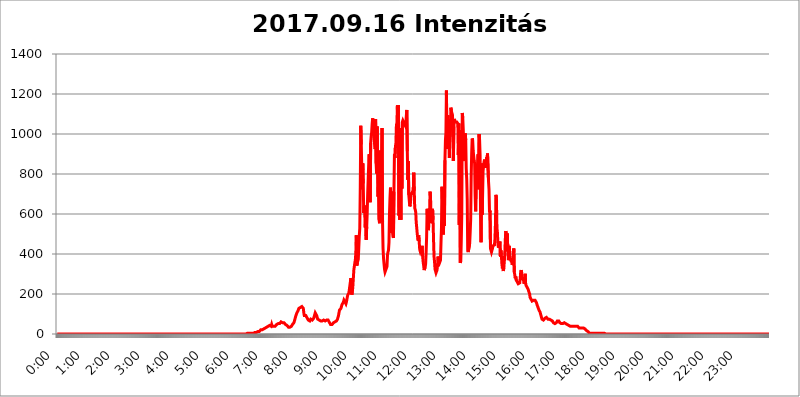
| Category | 2017.09.16 Intenzitás [W/m^2] |
|---|---|
| 0.0 | 0 |
| 0.0006944444444444445 | 0 |
| 0.001388888888888889 | 0 |
| 0.0020833333333333333 | 0 |
| 0.002777777777777778 | 0 |
| 0.003472222222222222 | 0 |
| 0.004166666666666667 | 0 |
| 0.004861111111111111 | 0 |
| 0.005555555555555556 | 0 |
| 0.0062499999999999995 | 0 |
| 0.006944444444444444 | 0 |
| 0.007638888888888889 | 0 |
| 0.008333333333333333 | 0 |
| 0.009027777777777779 | 0 |
| 0.009722222222222222 | 0 |
| 0.010416666666666666 | 0 |
| 0.011111111111111112 | 0 |
| 0.011805555555555555 | 0 |
| 0.012499999999999999 | 0 |
| 0.013194444444444444 | 0 |
| 0.013888888888888888 | 0 |
| 0.014583333333333332 | 0 |
| 0.015277777777777777 | 0 |
| 0.015972222222222224 | 0 |
| 0.016666666666666666 | 0 |
| 0.017361111111111112 | 0 |
| 0.018055555555555557 | 0 |
| 0.01875 | 0 |
| 0.019444444444444445 | 0 |
| 0.02013888888888889 | 0 |
| 0.020833333333333332 | 0 |
| 0.02152777777777778 | 0 |
| 0.022222222222222223 | 0 |
| 0.02291666666666667 | 0 |
| 0.02361111111111111 | 0 |
| 0.024305555555555556 | 0 |
| 0.024999999999999998 | 0 |
| 0.025694444444444447 | 0 |
| 0.02638888888888889 | 0 |
| 0.027083333333333334 | 0 |
| 0.027777777777777776 | 0 |
| 0.02847222222222222 | 0 |
| 0.029166666666666664 | 0 |
| 0.029861111111111113 | 0 |
| 0.030555555555555555 | 0 |
| 0.03125 | 0 |
| 0.03194444444444445 | 0 |
| 0.03263888888888889 | 0 |
| 0.03333333333333333 | 0 |
| 0.034027777777777775 | 0 |
| 0.034722222222222224 | 0 |
| 0.035416666666666666 | 0 |
| 0.036111111111111115 | 0 |
| 0.03680555555555556 | 0 |
| 0.0375 | 0 |
| 0.03819444444444444 | 0 |
| 0.03888888888888889 | 0 |
| 0.03958333333333333 | 0 |
| 0.04027777777777778 | 0 |
| 0.04097222222222222 | 0 |
| 0.041666666666666664 | 0 |
| 0.042361111111111106 | 0 |
| 0.04305555555555556 | 0 |
| 0.043750000000000004 | 0 |
| 0.044444444444444446 | 0 |
| 0.04513888888888889 | 0 |
| 0.04583333333333334 | 0 |
| 0.04652777777777778 | 0 |
| 0.04722222222222222 | 0 |
| 0.04791666666666666 | 0 |
| 0.04861111111111111 | 0 |
| 0.049305555555555554 | 0 |
| 0.049999999999999996 | 0 |
| 0.05069444444444445 | 0 |
| 0.051388888888888894 | 0 |
| 0.052083333333333336 | 0 |
| 0.05277777777777778 | 0 |
| 0.05347222222222222 | 0 |
| 0.05416666666666667 | 0 |
| 0.05486111111111111 | 0 |
| 0.05555555555555555 | 0 |
| 0.05625 | 0 |
| 0.05694444444444444 | 0 |
| 0.057638888888888885 | 0 |
| 0.05833333333333333 | 0 |
| 0.05902777777777778 | 0 |
| 0.059722222222222225 | 0 |
| 0.06041666666666667 | 0 |
| 0.061111111111111116 | 0 |
| 0.06180555555555556 | 0 |
| 0.0625 | 0 |
| 0.06319444444444444 | 0 |
| 0.06388888888888888 | 0 |
| 0.06458333333333334 | 0 |
| 0.06527777777777778 | 0 |
| 0.06597222222222222 | 0 |
| 0.06666666666666667 | 0 |
| 0.06736111111111111 | 0 |
| 0.06805555555555555 | 0 |
| 0.06874999999999999 | 0 |
| 0.06944444444444443 | 0 |
| 0.07013888888888889 | 0 |
| 0.07083333333333333 | 0 |
| 0.07152777777777779 | 0 |
| 0.07222222222222223 | 0 |
| 0.07291666666666667 | 0 |
| 0.07361111111111111 | 0 |
| 0.07430555555555556 | 0 |
| 0.075 | 0 |
| 0.07569444444444444 | 0 |
| 0.0763888888888889 | 0 |
| 0.07708333333333334 | 0 |
| 0.07777777777777778 | 0 |
| 0.07847222222222222 | 0 |
| 0.07916666666666666 | 0 |
| 0.0798611111111111 | 0 |
| 0.08055555555555556 | 0 |
| 0.08125 | 0 |
| 0.08194444444444444 | 0 |
| 0.08263888888888889 | 0 |
| 0.08333333333333333 | 0 |
| 0.08402777777777777 | 0 |
| 0.08472222222222221 | 0 |
| 0.08541666666666665 | 0 |
| 0.08611111111111112 | 0 |
| 0.08680555555555557 | 0 |
| 0.08750000000000001 | 0 |
| 0.08819444444444445 | 0 |
| 0.08888888888888889 | 0 |
| 0.08958333333333333 | 0 |
| 0.09027777777777778 | 0 |
| 0.09097222222222222 | 0 |
| 0.09166666666666667 | 0 |
| 0.09236111111111112 | 0 |
| 0.09305555555555556 | 0 |
| 0.09375 | 0 |
| 0.09444444444444444 | 0 |
| 0.09513888888888888 | 0 |
| 0.09583333333333333 | 0 |
| 0.09652777777777777 | 0 |
| 0.09722222222222222 | 0 |
| 0.09791666666666667 | 0 |
| 0.09861111111111111 | 0 |
| 0.09930555555555555 | 0 |
| 0.09999999999999999 | 0 |
| 0.10069444444444443 | 0 |
| 0.1013888888888889 | 0 |
| 0.10208333333333335 | 0 |
| 0.10277777777777779 | 0 |
| 0.10347222222222223 | 0 |
| 0.10416666666666667 | 0 |
| 0.10486111111111111 | 0 |
| 0.10555555555555556 | 0 |
| 0.10625 | 0 |
| 0.10694444444444444 | 0 |
| 0.1076388888888889 | 0 |
| 0.10833333333333334 | 0 |
| 0.10902777777777778 | 0 |
| 0.10972222222222222 | 0 |
| 0.1111111111111111 | 0 |
| 0.11180555555555556 | 0 |
| 0.11180555555555556 | 0 |
| 0.1125 | 0 |
| 0.11319444444444444 | 0 |
| 0.11388888888888889 | 0 |
| 0.11458333333333333 | 0 |
| 0.11527777777777777 | 0 |
| 0.11597222222222221 | 0 |
| 0.11666666666666665 | 0 |
| 0.1173611111111111 | 0 |
| 0.11805555555555557 | 0 |
| 0.11944444444444445 | 0 |
| 0.12013888888888889 | 0 |
| 0.12083333333333333 | 0 |
| 0.12152777777777778 | 0 |
| 0.12222222222222223 | 0 |
| 0.12291666666666667 | 0 |
| 0.12291666666666667 | 0 |
| 0.12361111111111112 | 0 |
| 0.12430555555555556 | 0 |
| 0.125 | 0 |
| 0.12569444444444444 | 0 |
| 0.12638888888888888 | 0 |
| 0.12708333333333333 | 0 |
| 0.16875 | 0 |
| 0.12847222222222224 | 0 |
| 0.12916666666666668 | 0 |
| 0.12986111111111112 | 0 |
| 0.13055555555555556 | 0 |
| 0.13125 | 0 |
| 0.13194444444444445 | 0 |
| 0.1326388888888889 | 0 |
| 0.13333333333333333 | 0 |
| 0.13402777777777777 | 0 |
| 0.13402777777777777 | 0 |
| 0.13472222222222222 | 0 |
| 0.13541666666666666 | 0 |
| 0.1361111111111111 | 0 |
| 0.13749999999999998 | 0 |
| 0.13819444444444443 | 0 |
| 0.1388888888888889 | 0 |
| 0.13958333333333334 | 0 |
| 0.14027777777777778 | 0 |
| 0.14097222222222222 | 0 |
| 0.14166666666666666 | 0 |
| 0.1423611111111111 | 0 |
| 0.14305555555555557 | 0 |
| 0.14375000000000002 | 0 |
| 0.14444444444444446 | 0 |
| 0.1451388888888889 | 0 |
| 0.1451388888888889 | 0 |
| 0.14652777777777778 | 0 |
| 0.14722222222222223 | 0 |
| 0.14791666666666667 | 0 |
| 0.1486111111111111 | 0 |
| 0.14930555555555555 | 0 |
| 0.15 | 0 |
| 0.15069444444444444 | 0 |
| 0.15138888888888888 | 0 |
| 0.15208333333333332 | 0 |
| 0.15277777777777776 | 0 |
| 0.15347222222222223 | 0 |
| 0.15416666666666667 | 0 |
| 0.15486111111111112 | 0 |
| 0.15555555555555556 | 0 |
| 0.15625 | 0 |
| 0.15694444444444444 | 0 |
| 0.15763888888888888 | 0 |
| 0.15833333333333333 | 0 |
| 0.15902777777777777 | 0 |
| 0.15972222222222224 | 0 |
| 0.16041666666666668 | 0 |
| 0.16111111111111112 | 0 |
| 0.16180555555555556 | 0 |
| 0.1625 | 0 |
| 0.16319444444444445 | 0 |
| 0.1638888888888889 | 0 |
| 0.16458333333333333 | 0 |
| 0.16527777777777777 | 0 |
| 0.16597222222222222 | 0 |
| 0.16666666666666666 | 0 |
| 0.1673611111111111 | 0 |
| 0.16805555555555554 | 0 |
| 0.16874999999999998 | 0 |
| 0.16944444444444443 | 0 |
| 0.17013888888888887 | 0 |
| 0.1708333333333333 | 0 |
| 0.17152777777777775 | 0 |
| 0.17222222222222225 | 0 |
| 0.1729166666666667 | 0 |
| 0.17361111111111113 | 0 |
| 0.17430555555555557 | 0 |
| 0.17500000000000002 | 0 |
| 0.17569444444444446 | 0 |
| 0.1763888888888889 | 0 |
| 0.17708333333333334 | 0 |
| 0.17777777777777778 | 0 |
| 0.17847222222222223 | 0 |
| 0.17916666666666667 | 0 |
| 0.1798611111111111 | 0 |
| 0.18055555555555555 | 0 |
| 0.18125 | 0 |
| 0.18194444444444444 | 0 |
| 0.1826388888888889 | 0 |
| 0.18333333333333335 | 0 |
| 0.1840277777777778 | 0 |
| 0.18472222222222223 | 0 |
| 0.18541666666666667 | 0 |
| 0.18611111111111112 | 0 |
| 0.18680555555555556 | 0 |
| 0.1875 | 0 |
| 0.18819444444444444 | 0 |
| 0.18888888888888888 | 0 |
| 0.18958333333333333 | 0 |
| 0.19027777777777777 | 0 |
| 0.1909722222222222 | 0 |
| 0.19166666666666665 | 0 |
| 0.19236111111111112 | 0 |
| 0.19305555555555554 | 0 |
| 0.19375 | 0 |
| 0.19444444444444445 | 0 |
| 0.1951388888888889 | 0 |
| 0.19583333333333333 | 0 |
| 0.19652777777777777 | 0 |
| 0.19722222222222222 | 0 |
| 0.19791666666666666 | 0 |
| 0.1986111111111111 | 0 |
| 0.19930555555555554 | 0 |
| 0.19999999999999998 | 0 |
| 0.20069444444444443 | 0 |
| 0.20138888888888887 | 0 |
| 0.2020833333333333 | 0 |
| 0.2027777777777778 | 0 |
| 0.2034722222222222 | 0 |
| 0.2041666666666667 | 0 |
| 0.20486111111111113 | 0 |
| 0.20555555555555557 | 0 |
| 0.20625000000000002 | 0 |
| 0.20694444444444446 | 0 |
| 0.2076388888888889 | 0 |
| 0.20833333333333334 | 0 |
| 0.20902777777777778 | 0 |
| 0.20972222222222223 | 0 |
| 0.21041666666666667 | 0 |
| 0.2111111111111111 | 0 |
| 0.21180555555555555 | 0 |
| 0.2125 | 0 |
| 0.21319444444444444 | 0 |
| 0.2138888888888889 | 0 |
| 0.21458333333333335 | 0 |
| 0.2152777777777778 | 0 |
| 0.21597222222222223 | 0 |
| 0.21666666666666667 | 0 |
| 0.21736111111111112 | 0 |
| 0.21805555555555556 | 0 |
| 0.21875 | 0 |
| 0.21944444444444444 | 0 |
| 0.22013888888888888 | 0 |
| 0.22083333333333333 | 0 |
| 0.22152777777777777 | 0 |
| 0.2222222222222222 | 0 |
| 0.22291666666666665 | 0 |
| 0.2236111111111111 | 0 |
| 0.22430555555555556 | 0 |
| 0.225 | 0 |
| 0.22569444444444445 | 0 |
| 0.2263888888888889 | 0 |
| 0.22708333333333333 | 0 |
| 0.22777777777777777 | 0 |
| 0.22847222222222222 | 0 |
| 0.22916666666666666 | 0 |
| 0.2298611111111111 | 0 |
| 0.23055555555555554 | 0 |
| 0.23124999999999998 | 0 |
| 0.23194444444444443 | 0 |
| 0.23263888888888887 | 0 |
| 0.2333333333333333 | 0 |
| 0.2340277777777778 | 0 |
| 0.2347222222222222 | 0 |
| 0.2354166666666667 | 0 |
| 0.23611111111111113 | 0 |
| 0.23680555555555557 | 0 |
| 0.23750000000000002 | 0 |
| 0.23819444444444446 | 0 |
| 0.2388888888888889 | 0 |
| 0.23958333333333334 | 0 |
| 0.24027777777777778 | 0 |
| 0.24097222222222223 | 0 |
| 0.24166666666666667 | 0 |
| 0.2423611111111111 | 0 |
| 0.24305555555555555 | 0 |
| 0.24375 | 0 |
| 0.24444444444444446 | 0 |
| 0.24513888888888888 | 0 |
| 0.24583333333333335 | 0 |
| 0.2465277777777778 | 0 |
| 0.24722222222222223 | 0 |
| 0.24791666666666667 | 0 |
| 0.24861111111111112 | 0 |
| 0.24930555555555556 | 0 |
| 0.25 | 0 |
| 0.25069444444444444 | 0 |
| 0.2513888888888889 | 0 |
| 0.2520833333333333 | 0 |
| 0.25277777777777777 | 0 |
| 0.2534722222222222 | 0 |
| 0.25416666666666665 | 0 |
| 0.2548611111111111 | 0 |
| 0.2555555555555556 | 0 |
| 0.25625000000000003 | 0 |
| 0.2569444444444445 | 0 |
| 0.2576388888888889 | 0 |
| 0.25833333333333336 | 0 |
| 0.2590277777777778 | 0 |
| 0.25972222222222224 | 0 |
| 0.2604166666666667 | 0 |
| 0.2611111111111111 | 0 |
| 0.26180555555555557 | 0 |
| 0.2625 | 0 |
| 0.26319444444444445 | 0 |
| 0.2638888888888889 | 0 |
| 0.26458333333333334 | 0 |
| 0.2652777777777778 | 3.525 |
| 0.2659722222222222 | 3.525 |
| 0.26666666666666666 | 3.525 |
| 0.2673611111111111 | 3.525 |
| 0.26805555555555555 | 3.525 |
| 0.26875 | 3.525 |
| 0.26944444444444443 | 3.525 |
| 0.2701388888888889 | 3.525 |
| 0.2708333333333333 | 3.525 |
| 0.27152777777777776 | 3.525 |
| 0.2722222222222222 | 3.525 |
| 0.27291666666666664 | 3.525 |
| 0.2736111111111111 | 3.525 |
| 0.2743055555555555 | 3.525 |
| 0.27499999999999997 | 3.525 |
| 0.27569444444444446 | 3.525 |
| 0.27638888888888885 | 3.525 |
| 0.27708333333333335 | 7.887 |
| 0.2777777777777778 | 7.887 |
| 0.27847222222222223 | 7.887 |
| 0.2791666666666667 | 7.887 |
| 0.2798611111111111 | 7.887 |
| 0.28055555555555556 | 12.257 |
| 0.28125 | 12.257 |
| 0.28194444444444444 | 12.257 |
| 0.2826388888888889 | 12.257 |
| 0.2833333333333333 | 12.257 |
| 0.28402777777777777 | 16.636 |
| 0.2847222222222222 | 16.636 |
| 0.28541666666666665 | 21.024 |
| 0.28611111111111115 | 21.024 |
| 0.28680555555555554 | 21.024 |
| 0.28750000000000003 | 21.024 |
| 0.2881944444444445 | 25.419 |
| 0.2888888888888889 | 25.419 |
| 0.28958333333333336 | 25.419 |
| 0.2902777777777778 | 29.823 |
| 0.29097222222222224 | 29.823 |
| 0.2916666666666667 | 29.823 |
| 0.2923611111111111 | 29.823 |
| 0.29305555555555557 | 34.234 |
| 0.29375 | 34.234 |
| 0.29444444444444445 | 38.653 |
| 0.2951388888888889 | 38.653 |
| 0.29583333333333334 | 38.653 |
| 0.2965277777777778 | 43.079 |
| 0.2972222222222222 | 43.079 |
| 0.29791666666666666 | 43.079 |
| 0.2986111111111111 | 43.079 |
| 0.29930555555555555 | 43.079 |
| 0.3 | 38.653 |
| 0.30069444444444443 | 47.511 |
| 0.3013888888888889 | 38.653 |
| 0.3020833333333333 | 38.653 |
| 0.30277777777777776 | 38.653 |
| 0.3034722222222222 | 38.653 |
| 0.30416666666666664 | 38.653 |
| 0.3048611111111111 | 38.653 |
| 0.3055555555555555 | 38.653 |
| 0.30624999999999997 | 43.079 |
| 0.3069444444444444 | 43.079 |
| 0.3076388888888889 | 47.511 |
| 0.30833333333333335 | 51.951 |
| 0.3090277777777778 | 51.951 |
| 0.30972222222222223 | 51.951 |
| 0.3104166666666667 | 51.951 |
| 0.3111111111111111 | 47.511 |
| 0.31180555555555556 | 51.951 |
| 0.3125 | 56.398 |
| 0.31319444444444444 | 56.398 |
| 0.3138888888888889 | 60.85 |
| 0.3145833333333333 | 60.85 |
| 0.31527777777777777 | 56.398 |
| 0.3159722222222222 | 56.398 |
| 0.31666666666666665 | 56.398 |
| 0.31736111111111115 | 56.398 |
| 0.31805555555555554 | 56.398 |
| 0.31875000000000003 | 56.398 |
| 0.3194444444444445 | 51.951 |
| 0.3201388888888889 | 47.511 |
| 0.32083333333333336 | 47.511 |
| 0.3215277777777778 | 43.079 |
| 0.32222222222222224 | 43.079 |
| 0.3229166666666667 | 38.653 |
| 0.3236111111111111 | 38.653 |
| 0.32430555555555557 | 34.234 |
| 0.325 | 34.234 |
| 0.32569444444444445 | 34.234 |
| 0.3263888888888889 | 34.234 |
| 0.32708333333333334 | 34.234 |
| 0.3277777777777778 | 34.234 |
| 0.3284722222222222 | 38.653 |
| 0.32916666666666666 | 43.079 |
| 0.3298611111111111 | 47.511 |
| 0.33055555555555555 | 47.511 |
| 0.33125 | 51.951 |
| 0.33194444444444443 | 56.398 |
| 0.3326388888888889 | 65.31 |
| 0.3333333333333333 | 74.246 |
| 0.3340277777777778 | 83.205 |
| 0.3347222222222222 | 92.184 |
| 0.3354166666666667 | 96.682 |
| 0.3361111111111111 | 105.69 |
| 0.3368055555555556 | 110.201 |
| 0.33749999999999997 | 114.716 |
| 0.33819444444444446 | 119.235 |
| 0.33888888888888885 | 128.284 |
| 0.33958333333333335 | 128.284 |
| 0.34027777777777773 | 132.814 |
| 0.34097222222222223 | 132.814 |
| 0.3416666666666666 | 132.814 |
| 0.3423611111111111 | 132.814 |
| 0.3430555555555555 | 137.347 |
| 0.34375 | 137.347 |
| 0.3444444444444445 | 137.347 |
| 0.3451388888888889 | 128.284 |
| 0.3458333333333334 | 105.69 |
| 0.34652777777777777 | 92.184 |
| 0.34722222222222227 | 87.692 |
| 0.34791666666666665 | 92.184 |
| 0.34861111111111115 | 92.184 |
| 0.34930555555555554 | 92.184 |
| 0.35000000000000003 | 87.692 |
| 0.3506944444444444 | 78.722 |
| 0.3513888888888889 | 74.246 |
| 0.3520833333333333 | 69.775 |
| 0.3527777777777778 | 65.31 |
| 0.3534722222222222 | 65.31 |
| 0.3541666666666667 | 65.31 |
| 0.3548611111111111 | 65.31 |
| 0.35555555555555557 | 74.246 |
| 0.35625 | 78.722 |
| 0.35694444444444445 | 74.246 |
| 0.3576388888888889 | 69.775 |
| 0.35833333333333334 | 69.775 |
| 0.3590277777777778 | 74.246 |
| 0.3597222222222222 | 78.722 |
| 0.36041666666666666 | 87.692 |
| 0.3611111111111111 | 96.682 |
| 0.36180555555555555 | 105.69 |
| 0.3625 | 105.69 |
| 0.36319444444444443 | 101.184 |
| 0.3638888888888889 | 92.184 |
| 0.3645833333333333 | 83.205 |
| 0.3652777777777778 | 74.246 |
| 0.3659722222222222 | 69.775 |
| 0.3666666666666667 | 69.775 |
| 0.3673611111111111 | 69.775 |
| 0.3680555555555556 | 65.31 |
| 0.36874999999999997 | 65.31 |
| 0.36944444444444446 | 65.31 |
| 0.37013888888888885 | 65.31 |
| 0.37083333333333335 | 65.31 |
| 0.37152777777777773 | 65.31 |
| 0.37222222222222223 | 69.775 |
| 0.3729166666666666 | 69.775 |
| 0.3736111111111111 | 69.775 |
| 0.3743055555555555 | 69.775 |
| 0.375 | 65.31 |
| 0.3756944444444445 | 65.31 |
| 0.3763888888888889 | 65.31 |
| 0.3770833333333334 | 65.31 |
| 0.37777777777777777 | 69.775 |
| 0.37847222222222227 | 69.775 |
| 0.37916666666666665 | 69.775 |
| 0.37986111111111115 | 69.775 |
| 0.38055555555555554 | 69.775 |
| 0.38125000000000003 | 65.31 |
| 0.3819444444444444 | 56.398 |
| 0.3826388888888889 | 51.951 |
| 0.3833333333333333 | 47.511 |
| 0.3840277777777778 | 47.511 |
| 0.3847222222222222 | 47.511 |
| 0.3854166666666667 | 47.511 |
| 0.3861111111111111 | 51.951 |
| 0.38680555555555557 | 51.951 |
| 0.3875 | 56.398 |
| 0.38819444444444445 | 56.398 |
| 0.3888888888888889 | 60.85 |
| 0.38958333333333334 | 60.85 |
| 0.3902777777777778 | 60.85 |
| 0.3909722222222222 | 65.31 |
| 0.39166666666666666 | 65.31 |
| 0.3923611111111111 | 65.31 |
| 0.39305555555555555 | 74.246 |
| 0.39375 | 78.722 |
| 0.39444444444444443 | 92.184 |
| 0.3951388888888889 | 105.69 |
| 0.3958333333333333 | 119.235 |
| 0.3965277777777778 | 123.758 |
| 0.3972222222222222 | 123.758 |
| 0.3979166666666667 | 128.284 |
| 0.3986111111111111 | 137.347 |
| 0.3993055555555556 | 146.423 |
| 0.39999999999999997 | 150.964 |
| 0.40069444444444446 | 150.964 |
| 0.40138888888888885 | 160.056 |
| 0.40208333333333335 | 169.156 |
| 0.40277777777777773 | 173.709 |
| 0.40347222222222223 | 160.056 |
| 0.4041666666666666 | 155.509 |
| 0.4048611111111111 | 150.964 |
| 0.4055555555555555 | 160.056 |
| 0.40625 | 173.709 |
| 0.4069444444444445 | 187.378 |
| 0.4076388888888889 | 196.497 |
| 0.4083333333333334 | 196.497 |
| 0.40902777777777777 | 205.62 |
| 0.40972222222222227 | 223.873 |
| 0.41041666666666665 | 242.127 |
| 0.41111111111111115 | 260.373 |
| 0.41180555555555554 | 278.603 |
| 0.41250000000000003 | 205.62 |
| 0.4131944444444444 | 196.497 |
| 0.4138888888888889 | 210.182 |
| 0.4145833333333333 | 237.564 |
| 0.4152777777777778 | 278.603 |
| 0.4159722222222222 | 319.517 |
| 0.4166666666666667 | 337.639 |
| 0.4173611111111111 | 355.712 |
| 0.41805555555555557 | 369.23 |
| 0.41875 | 405.108 |
| 0.41944444444444445 | 493.475 |
| 0.4201388888888889 | 342.162 |
| 0.42083333333333334 | 355.712 |
| 0.4215277777777778 | 360.221 |
| 0.4222222222222222 | 373.729 |
| 0.42291666666666666 | 431.833 |
| 0.4236111111111111 | 489.108 |
| 0.42430555555555555 | 528.2 |
| 0.425 | 731.896 |
| 0.42569444444444443 | 1041.019 |
| 0.4263888888888889 | 947.58 |
| 0.4270833333333333 | 947.58 |
| 0.4277777777777778 | 723.889 |
| 0.4284722222222222 | 853.029 |
| 0.4291666666666667 | 751.803 |
| 0.4298611111111111 | 604.864 |
| 0.4305555555555556 | 642.4 |
| 0.43124999999999997 | 604.864 |
| 0.43194444444444446 | 532.513 |
| 0.43263888888888885 | 579.542 |
| 0.43333333333333335 | 471.582 |
| 0.43402777777777773 | 536.82 |
| 0.43472222222222223 | 604.864 |
| 0.4354166666666666 | 703.762 |
| 0.4361111111111111 | 699.717 |
| 0.4368055555555555 | 845.365 |
| 0.4375 | 898.668 |
| 0.4381944444444445 | 802.868 |
| 0.4388888888888889 | 658.909 |
| 0.4395833333333334 | 955.071 |
| 0.44027777777777777 | 988.714 |
| 0.44097222222222227 | 1007.383 |
| 0.44166666666666665 | 1052.255 |
| 0.44236111111111115 | 1078.555 |
| 0.44305555555555554 | 1082.324 |
| 0.44375000000000003 | 992.448 |
| 0.4444444444444444 | 996.182 |
| 0.4451388888888889 | 988.714 |
| 0.4458333333333333 | 925.06 |
| 0.4465277777777778 | 1074.789 |
| 0.4472222222222222 | 853.029 |
| 0.4479166666666667 | 802.868 |
| 0.4486111111111111 | 1037.277 |
| 0.44930555555555557 | 1037.277 |
| 0.45 | 687.544 |
| 0.45069444444444445 | 767.62 |
| 0.4513888888888889 | 571.049 |
| 0.45208333333333334 | 553.986 |
| 0.4527777777777778 | 775.492 |
| 0.4534722222222222 | 917.534 |
| 0.45416666666666666 | 763.674 |
| 0.4548611111111111 | 879.719 |
| 0.45555555555555555 | 1029.798 |
| 0.45625 | 558.261 |
| 0.45694444444444443 | 427.39 |
| 0.4576388888888889 | 378.224 |
| 0.4583333333333333 | 351.198 |
| 0.4590277777777778 | 324.052 |
| 0.4597222222222222 | 310.44 |
| 0.4604166666666667 | 310.44 |
| 0.4611111111111111 | 324.052 |
| 0.4618055555555556 | 324.052 |
| 0.46249999999999997 | 337.639 |
| 0.46319444444444446 | 396.164 |
| 0.46388888888888885 | 409.574 |
| 0.46458333333333335 | 418.492 |
| 0.46527777777777773 | 458.38 |
| 0.46597222222222223 | 600.661 |
| 0.4666666666666666 | 679.395 |
| 0.4673611111111111 | 731.896 |
| 0.4680555555555555 | 506.542 |
| 0.46875 | 536.82 |
| 0.4694444444444445 | 711.832 |
| 0.4701388888888889 | 510.885 |
| 0.4708333333333334 | 489.108 |
| 0.47152777777777777 | 480.356 |
| 0.47222222222222227 | 711.832 |
| 0.47291666666666665 | 898.668 |
| 0.47361111111111115 | 879.719 |
| 0.47430555555555554 | 936.33 |
| 0.47500000000000003 | 955.071 |
| 0.4756944444444444 | 1044.762 |
| 0.4763888888888889 | 1056.004 |
| 0.4770833333333333 | 1143.232 |
| 0.4777777777777778 | 966.295 |
| 0.4784722222222222 | 1143.232 |
| 0.4791666666666667 | 592.233 |
| 0.4798611111111111 | 600.661 |
| 0.48055555555555557 | 571.049 |
| 0.48125 | 791.169 |
| 0.48194444444444445 | 571.049 |
| 0.4826388888888889 | 1029.798 |
| 0.48333333333333334 | 727.896 |
| 0.4840277777777778 | 1059.756 |
| 0.4847222222222222 | 1067.267 |
| 0.48541666666666666 | 1063.51 |
| 0.4861111111111111 | 1056.004 |
| 0.48680555555555555 | 1059.756 |
| 0.4875 | 1052.255 |
| 0.48819444444444443 | 1041.019 |
| 0.4888888888888889 | 1048.508 |
| 0.4895833333333333 | 1089.873 |
| 0.4902777777777778 | 1120.238 |
| 0.4909722222222222 | 913.766 |
| 0.4916666666666667 | 771.559 |
| 0.4923611111111111 | 864.493 |
| 0.4930555555555556 | 695.666 |
| 0.49374999999999997 | 695.666 |
| 0.49444444444444446 | 638.256 |
| 0.49513888888888885 | 646.537 |
| 0.49583333333333335 | 650.667 |
| 0.49652777777777773 | 707.8 |
| 0.49722222222222223 | 707.8 |
| 0.4979166666666666 | 695.666 |
| 0.4986111111111111 | 715.858 |
| 0.4993055555555555 | 707.8 |
| 0.5 | 806.757 |
| 0.5006944444444444 | 715.858 |
| 0.5013888888888889 | 629.948 |
| 0.5020833333333333 | 621.613 |
| 0.5027777777777778 | 609.062 |
| 0.5034722222222222 | 558.261 |
| 0.5041666666666667 | 532.513 |
| 0.5048611111111111 | 502.192 |
| 0.5055555555555555 | 480.356 |
| 0.50625 | 467.187 |
| 0.5069444444444444 | 493.475 |
| 0.5076388888888889 | 462.786 |
| 0.5083333333333333 | 422.943 |
| 0.5090277777777777 | 414.035 |
| 0.5097222222222222 | 422.943 |
| 0.5104166666666666 | 418.492 |
| 0.5111111111111112 | 422.943 |
| 0.5118055555555555 | 440.702 |
| 0.5125000000000001 | 387.202 |
| 0.5131944444444444 | 360.221 |
| 0.513888888888889 | 342.162 |
| 0.5145833333333333 | 319.517 |
| 0.5152777777777778 | 319.517 |
| 0.5159722222222222 | 333.113 |
| 0.5166666666666667 | 351.198 |
| 0.517361111111111 | 409.574 |
| 0.5180555555555556 | 484.735 |
| 0.5187499999999999 | 625.784 |
| 0.5194444444444445 | 571.049 |
| 0.5201388888888888 | 519.555 |
| 0.5208333333333334 | 528.2 |
| 0.5215277777777778 | 609.062 |
| 0.5222222222222223 | 621.613 |
| 0.5229166666666667 | 711.832 |
| 0.5236111111111111 | 679.395 |
| 0.5243055555555556 | 553.986 |
| 0.525 | 562.53 |
| 0.5256944444444445 | 571.049 |
| 0.5263888888888889 | 625.784 |
| 0.5270833333333333 | 571.049 |
| 0.5277777777777778 | 471.582 |
| 0.5284722222222222 | 387.202 |
| 0.5291666666666667 | 360.221 |
| 0.5298611111111111 | 324.052 |
| 0.5305555555555556 | 314.98 |
| 0.53125 | 305.898 |
| 0.5319444444444444 | 310.44 |
| 0.5326388888888889 | 319.517 |
| 0.5333333333333333 | 342.162 |
| 0.5340277777777778 | 387.202 |
| 0.5347222222222222 | 369.23 |
| 0.5354166666666667 | 369.23 |
| 0.5361111111111111 | 355.712 |
| 0.5368055555555555 | 360.221 |
| 0.5375 | 369.23 |
| 0.5381944444444444 | 453.968 |
| 0.5388888888888889 | 532.513 |
| 0.5395833333333333 | 735.89 |
| 0.5402777777777777 | 663.019 |
| 0.5409722222222222 | 625.784 |
| 0.5416666666666666 | 497.836 |
| 0.5423611111111112 | 691.608 |
| 0.5430555555555555 | 541.121 |
| 0.5437500000000001 | 868.305 |
| 0.5444444444444444 | 970.034 |
| 0.545138888888889 | 1007.383 |
| 0.5458333333333333 | 1217.812 |
| 0.5465277777777778 | 925.06 |
| 0.5472222222222222 | 1082.324 |
| 0.5479166666666667 | 1093.653 |
| 0.548611111111111 | 973.772 |
| 0.5493055555555556 | 1074.789 |
| 0.5499999999999999 | 879.719 |
| 0.5506944444444445 | 981.244 |
| 0.5513888888888888 | 988.714 |
| 0.5520833333333334 | 1131.708 |
| 0.5527777777777778 | 1116.426 |
| 0.5534722222222223 | 1105.019 |
| 0.5541666666666667 | 1097.437 |
| 0.5548611111111111 | 1067.267 |
| 0.5555555555555556 | 864.493 |
| 0.55625 | 1037.277 |
| 0.5569444444444445 | 1074.789 |
| 0.5576388888888889 | 1067.267 |
| 0.5583333333333333 | 1059.756 |
| 0.5590277777777778 | 1059.756 |
| 0.5597222222222222 | 1056.004 |
| 0.5604166666666667 | 1059.756 |
| 0.5611111111111111 | 1063.51 |
| 0.5618055555555556 | 1052.255 |
| 0.5625 | 894.885 |
| 0.5631944444444444 | 1052.255 |
| 0.5638888888888889 | 545.416 |
| 0.5645833333333333 | 1018.587 |
| 0.5652777777777778 | 355.712 |
| 0.5659722222222222 | 364.728 |
| 0.5666666666666667 | 467.187 |
| 0.5673611111111111 | 596.45 |
| 0.5680555555555555 | 1105.019 |
| 0.56875 | 1082.324 |
| 0.5694444444444444 | 1022.323 |
| 0.5701388888888889 | 932.576 |
| 0.5708333333333333 | 864.493 |
| 0.5715277777777777 | 992.448 |
| 0.5722222222222222 | 1003.65 |
| 0.5729166666666666 | 970.034 |
| 0.5736111111111112 | 826.123 |
| 0.5743055555555555 | 775.492 |
| 0.5750000000000001 | 675.311 |
| 0.5756944444444444 | 418.492 |
| 0.576388888888889 | 409.574 |
| 0.5770833333333333 | 414.035 |
| 0.5777777777777778 | 409.574 |
| 0.5784722222222222 | 453.968 |
| 0.5791666666666667 | 510.885 |
| 0.579861111111111 | 575.299 |
| 0.5805555555555556 | 783.342 |
| 0.5812499999999999 | 906.223 |
| 0.5819444444444445 | 977.508 |
| 0.5826388888888888 | 970.034 |
| 0.5833333333333334 | 917.534 |
| 0.5840277777777778 | 891.099 |
| 0.5847222222222223 | 868.305 |
| 0.5854166666666667 | 853.029 |
| 0.5861111111111111 | 691.608 |
| 0.5868055555555556 | 613.252 |
| 0.5875 | 739.877 |
| 0.5881944444444445 | 814.519 |
| 0.5888888888888889 | 822.26 |
| 0.5895833333333333 | 856.855 |
| 0.5902777777777778 | 898.668 |
| 0.5909722222222222 | 723.889 |
| 0.5916666666666667 | 999.916 |
| 0.5923611111111111 | 970.034 |
| 0.5930555555555556 | 894.885 |
| 0.59375 | 583.779 |
| 0.5944444444444444 | 458.38 |
| 0.5951388888888889 | 853.029 |
| 0.5958333333333333 | 596.45 |
| 0.5965277777777778 | 687.544 |
| 0.5972222222222222 | 814.519 |
| 0.5979166666666667 | 837.682 |
| 0.5986111111111111 | 860.676 |
| 0.5993055555555555 | 872.114 |
| 0.6 | 829.981 |
| 0.6006944444444444 | 864.493 |
| 0.6013888888888889 | 829.981 |
| 0.6020833333333333 | 883.516 |
| 0.6027777777777777 | 872.114 |
| 0.6034722222222222 | 902.447 |
| 0.6041666666666666 | 902.447 |
| 0.6048611111111112 | 763.674 |
| 0.6055555555555555 | 723.889 |
| 0.6062500000000001 | 609.062 |
| 0.6069444444444444 | 617.436 |
| 0.607638888888889 | 427.39 |
| 0.6083333333333333 | 418.492 |
| 0.6090277777777778 | 409.574 |
| 0.6097222222222222 | 418.492 |
| 0.6104166666666667 | 427.39 |
| 0.611111111111111 | 440.702 |
| 0.6118055555555556 | 436.27 |
| 0.6124999999999999 | 445.129 |
| 0.6131944444444445 | 445.129 |
| 0.6138888888888888 | 475.972 |
| 0.6145833333333334 | 549.704 |
| 0.6152777777777778 | 695.666 |
| 0.6159722222222223 | 675.311 |
| 0.6166666666666667 | 532.513 |
| 0.6173611111111111 | 506.542 |
| 0.6180555555555556 | 449.551 |
| 0.61875 | 431.833 |
| 0.6194444444444445 | 445.129 |
| 0.6201388888888889 | 440.702 |
| 0.6208333333333333 | 462.786 |
| 0.6215277777777778 | 387.202 |
| 0.6222222222222222 | 418.492 |
| 0.6229166666666667 | 391.685 |
| 0.6236111111111111 | 351.198 |
| 0.6243055555555556 | 328.584 |
| 0.625 | 337.639 |
| 0.6256944444444444 | 314.98 |
| 0.6263888888888889 | 333.113 |
| 0.6270833333333333 | 364.728 |
| 0.6277777777777778 | 409.574 |
| 0.6284722222222222 | 475.972 |
| 0.6291666666666667 | 515.223 |
| 0.6298611111111111 | 480.356 |
| 0.6305555555555555 | 414.035 |
| 0.63125 | 502.192 |
| 0.6319444444444444 | 418.492 |
| 0.6326388888888889 | 369.23 |
| 0.6333333333333333 | 378.224 |
| 0.6340277777777777 | 440.702 |
| 0.6347222222222222 | 400.638 |
| 0.6354166666666666 | 382.715 |
| 0.6361111111111112 | 387.202 |
| 0.6368055555555555 | 360.221 |
| 0.6375000000000001 | 369.23 |
| 0.6381944444444444 | 346.682 |
| 0.638888888888889 | 360.221 |
| 0.6395833333333333 | 351.198 |
| 0.6402777777777778 | 427.39 |
| 0.6409722222222222 | 310.44 |
| 0.6416666666666667 | 296.808 |
| 0.642361111111111 | 278.603 |
| 0.6430555555555556 | 287.709 |
| 0.6437499999999999 | 269.49 |
| 0.6444444444444445 | 264.932 |
| 0.6451388888888888 | 260.373 |
| 0.6458333333333334 | 255.813 |
| 0.6465277777777778 | 251.251 |
| 0.6472222222222223 | 246.689 |
| 0.6479166666666667 | 246.689 |
| 0.6486111111111111 | 255.813 |
| 0.6493055555555556 | 278.603 |
| 0.65 | 310.44 |
| 0.6506944444444445 | 319.517 |
| 0.6513888888888889 | 305.898 |
| 0.6520833333333333 | 283.156 |
| 0.6527777777777778 | 269.49 |
| 0.6534722222222222 | 283.156 |
| 0.6541666666666667 | 264.932 |
| 0.6548611111111111 | 251.251 |
| 0.6555555555555556 | 269.49 |
| 0.65625 | 301.354 |
| 0.6569444444444444 | 251.251 |
| 0.6576388888888889 | 242.127 |
| 0.6583333333333333 | 237.564 |
| 0.6590277777777778 | 233 |
| 0.6597222222222222 | 237.564 |
| 0.6604166666666667 | 223.873 |
| 0.6611111111111111 | 214.746 |
| 0.6618055555555555 | 210.182 |
| 0.6625 | 201.058 |
| 0.6631944444444444 | 182.82 |
| 0.6638888888888889 | 178.264 |
| 0.6645833333333333 | 173.709 |
| 0.6652777777777777 | 169.156 |
| 0.6659722222222222 | 164.605 |
| 0.6666666666666666 | 164.605 |
| 0.6673611111111111 | 164.605 |
| 0.6680555555555556 | 169.156 |
| 0.6687500000000001 | 169.156 |
| 0.6694444444444444 | 169.156 |
| 0.6701388888888888 | 169.156 |
| 0.6708333333333334 | 169.156 |
| 0.6715277777777778 | 164.605 |
| 0.6722222222222222 | 155.509 |
| 0.6729166666666666 | 146.423 |
| 0.6736111111111112 | 141.884 |
| 0.6743055555555556 | 132.814 |
| 0.6749999999999999 | 128.284 |
| 0.6756944444444444 | 119.235 |
| 0.6763888888888889 | 114.716 |
| 0.6770833333333334 | 110.201 |
| 0.6777777777777777 | 101.184 |
| 0.6784722222222223 | 92.184 |
| 0.6791666666666667 | 83.205 |
| 0.6798611111111111 | 74.246 |
| 0.6805555555555555 | 69.775 |
| 0.68125 | 69.775 |
| 0.6819444444444445 | 69.775 |
| 0.6826388888888889 | 69.775 |
| 0.6833333333333332 | 74.246 |
| 0.6840277777777778 | 78.722 |
| 0.6847222222222222 | 83.205 |
| 0.6854166666666667 | 83.205 |
| 0.686111111111111 | 83.205 |
| 0.6868055555555556 | 83.205 |
| 0.6875 | 83.205 |
| 0.6881944444444444 | 74.246 |
| 0.688888888888889 | 74.246 |
| 0.6895833333333333 | 74.246 |
| 0.6902777777777778 | 74.246 |
| 0.6909722222222222 | 74.246 |
| 0.6916666666666668 | 74.246 |
| 0.6923611111111111 | 69.775 |
| 0.6930555555555555 | 69.775 |
| 0.69375 | 69.775 |
| 0.6944444444444445 | 65.31 |
| 0.6951388888888889 | 60.85 |
| 0.6958333333333333 | 56.398 |
| 0.6965277777777777 | 56.398 |
| 0.6972222222222223 | 51.951 |
| 0.6979166666666666 | 51.951 |
| 0.6986111111111111 | 56.398 |
| 0.6993055555555556 | 56.398 |
| 0.7000000000000001 | 56.398 |
| 0.7006944444444444 | 60.85 |
| 0.7013888888888888 | 65.31 |
| 0.7020833333333334 | 65.31 |
| 0.7027777777777778 | 65.31 |
| 0.7034722222222222 | 65.31 |
| 0.7041666666666666 | 60.85 |
| 0.7048611111111112 | 56.398 |
| 0.7055555555555556 | 56.398 |
| 0.7062499999999999 | 51.951 |
| 0.7069444444444444 | 51.951 |
| 0.7076388888888889 | 51.951 |
| 0.7083333333333334 | 51.951 |
| 0.7090277777777777 | 51.951 |
| 0.7097222222222223 | 56.398 |
| 0.7104166666666667 | 56.398 |
| 0.7111111111111111 | 56.398 |
| 0.7118055555555555 | 51.951 |
| 0.7125 | 51.951 |
| 0.7131944444444445 | 51.951 |
| 0.7138888888888889 | 51.951 |
| 0.7145833333333332 | 47.511 |
| 0.7152777777777778 | 47.511 |
| 0.7159722222222222 | 47.511 |
| 0.7166666666666667 | 47.511 |
| 0.717361111111111 | 43.079 |
| 0.7180555555555556 | 43.079 |
| 0.71875 | 43.079 |
| 0.7194444444444444 | 38.653 |
| 0.720138888888889 | 38.653 |
| 0.7208333333333333 | 38.653 |
| 0.7215277777777778 | 38.653 |
| 0.7222222222222222 | 38.653 |
| 0.7229166666666668 | 38.653 |
| 0.7236111111111111 | 38.653 |
| 0.7243055555555555 | 38.653 |
| 0.725 | 38.653 |
| 0.7256944444444445 | 38.653 |
| 0.7263888888888889 | 38.653 |
| 0.7270833333333333 | 38.653 |
| 0.7277777777777777 | 38.653 |
| 0.7284722222222223 | 43.079 |
| 0.7291666666666666 | 38.653 |
| 0.7298611111111111 | 38.653 |
| 0.7305555555555556 | 38.653 |
| 0.7312500000000001 | 34.234 |
| 0.7319444444444444 | 29.823 |
| 0.7326388888888888 | 29.823 |
| 0.7333333333333334 | 29.823 |
| 0.7340277777777778 | 29.823 |
| 0.7347222222222222 | 29.823 |
| 0.7354166666666666 | 29.823 |
| 0.7361111111111112 | 29.823 |
| 0.7368055555555556 | 29.823 |
| 0.7374999999999999 | 29.823 |
| 0.7381944444444444 | 29.823 |
| 0.7388888888888889 | 29.823 |
| 0.7395833333333334 | 29.823 |
| 0.7402777777777777 | 25.419 |
| 0.7409722222222223 | 21.024 |
| 0.7416666666666667 | 21.024 |
| 0.7423611111111111 | 16.636 |
| 0.7430555555555555 | 12.257 |
| 0.74375 | 12.257 |
| 0.7444444444444445 | 12.257 |
| 0.7451388888888889 | 7.887 |
| 0.7458333333333332 | 7.887 |
| 0.7465277777777778 | 3.525 |
| 0.7472222222222222 | 3.525 |
| 0.7479166666666667 | 3.525 |
| 0.748611111111111 | 3.525 |
| 0.7493055555555556 | 3.525 |
| 0.75 | 3.525 |
| 0.7506944444444444 | 3.525 |
| 0.751388888888889 | 3.525 |
| 0.7520833333333333 | 3.525 |
| 0.7527777777777778 | 3.525 |
| 0.7534722222222222 | 3.525 |
| 0.7541666666666668 | 3.525 |
| 0.7548611111111111 | 3.525 |
| 0.7555555555555555 | 3.525 |
| 0.75625 | 3.525 |
| 0.7569444444444445 | 3.525 |
| 0.7576388888888889 | 3.525 |
| 0.7583333333333333 | 3.525 |
| 0.7590277777777777 | 3.525 |
| 0.7597222222222223 | 3.525 |
| 0.7604166666666666 | 3.525 |
| 0.7611111111111111 | 3.525 |
| 0.7618055555555556 | 3.525 |
| 0.7625000000000001 | 3.525 |
| 0.7631944444444444 | 3.525 |
| 0.7638888888888888 | 3.525 |
| 0.7645833333333334 | 3.525 |
| 0.7652777777777778 | 3.525 |
| 0.7659722222222222 | 3.525 |
| 0.7666666666666666 | 3.525 |
| 0.7673611111111112 | 3.525 |
| 0.7680555555555556 | 3.525 |
| 0.7687499999999999 | 0 |
| 0.7694444444444444 | 0 |
| 0.7701388888888889 | 0 |
| 0.7708333333333334 | 0 |
| 0.7715277777777777 | 0 |
| 0.7722222222222223 | 0 |
| 0.7729166666666667 | 0 |
| 0.7736111111111111 | 0 |
| 0.7743055555555555 | 0 |
| 0.775 | 0 |
| 0.7756944444444445 | 0 |
| 0.7763888888888889 | 0 |
| 0.7770833333333332 | 0 |
| 0.7777777777777778 | 0 |
| 0.7784722222222222 | 0 |
| 0.7791666666666667 | 0 |
| 0.779861111111111 | 0 |
| 0.7805555555555556 | 0 |
| 0.78125 | 0 |
| 0.7819444444444444 | 0 |
| 0.782638888888889 | 0 |
| 0.7833333333333333 | 0 |
| 0.7840277777777778 | 0 |
| 0.7847222222222222 | 0 |
| 0.7854166666666668 | 0 |
| 0.7861111111111111 | 0 |
| 0.7868055555555555 | 0 |
| 0.7875 | 0 |
| 0.7881944444444445 | 0 |
| 0.7888888888888889 | 0 |
| 0.7895833333333333 | 0 |
| 0.7902777777777777 | 0 |
| 0.7909722222222223 | 0 |
| 0.7916666666666666 | 0 |
| 0.7923611111111111 | 0 |
| 0.7930555555555556 | 0 |
| 0.7937500000000001 | 0 |
| 0.7944444444444444 | 0 |
| 0.7951388888888888 | 0 |
| 0.7958333333333334 | 0 |
| 0.7965277777777778 | 0 |
| 0.7972222222222222 | 0 |
| 0.7979166666666666 | 0 |
| 0.7986111111111112 | 0 |
| 0.7993055555555556 | 0 |
| 0.7999999999999999 | 0 |
| 0.8006944444444444 | 0 |
| 0.8013888888888889 | 0 |
| 0.8020833333333334 | 0 |
| 0.8027777777777777 | 0 |
| 0.8034722222222223 | 0 |
| 0.8041666666666667 | 0 |
| 0.8048611111111111 | 0 |
| 0.8055555555555555 | 0 |
| 0.80625 | 0 |
| 0.8069444444444445 | 0 |
| 0.8076388888888889 | 0 |
| 0.8083333333333332 | 0 |
| 0.8090277777777778 | 0 |
| 0.8097222222222222 | 0 |
| 0.8104166666666667 | 0 |
| 0.811111111111111 | 0 |
| 0.8118055555555556 | 0 |
| 0.8125 | 0 |
| 0.8131944444444444 | 0 |
| 0.813888888888889 | 0 |
| 0.8145833333333333 | 0 |
| 0.8152777777777778 | 0 |
| 0.8159722222222222 | 0 |
| 0.8166666666666668 | 0 |
| 0.8173611111111111 | 0 |
| 0.8180555555555555 | 0 |
| 0.81875 | 0 |
| 0.8194444444444445 | 0 |
| 0.8201388888888889 | 0 |
| 0.8208333333333333 | 0 |
| 0.8215277777777777 | 0 |
| 0.8222222222222223 | 0 |
| 0.8229166666666666 | 0 |
| 0.8236111111111111 | 0 |
| 0.8243055555555556 | 0 |
| 0.8250000000000001 | 0 |
| 0.8256944444444444 | 0 |
| 0.8263888888888888 | 0 |
| 0.8270833333333334 | 0 |
| 0.8277777777777778 | 0 |
| 0.8284722222222222 | 0 |
| 0.8291666666666666 | 0 |
| 0.8298611111111112 | 0 |
| 0.8305555555555556 | 0 |
| 0.8312499999999999 | 0 |
| 0.8319444444444444 | 0 |
| 0.8326388888888889 | 0 |
| 0.8333333333333334 | 0 |
| 0.8340277777777777 | 0 |
| 0.8347222222222223 | 0 |
| 0.8354166666666667 | 0 |
| 0.8361111111111111 | 0 |
| 0.8368055555555555 | 0 |
| 0.8375 | 0 |
| 0.8381944444444445 | 0 |
| 0.8388888888888889 | 0 |
| 0.8395833333333332 | 0 |
| 0.8402777777777778 | 0 |
| 0.8409722222222222 | 0 |
| 0.8416666666666667 | 0 |
| 0.842361111111111 | 0 |
| 0.8430555555555556 | 0 |
| 0.84375 | 0 |
| 0.8444444444444444 | 0 |
| 0.845138888888889 | 0 |
| 0.8458333333333333 | 0 |
| 0.8465277777777778 | 0 |
| 0.8472222222222222 | 0 |
| 0.8479166666666668 | 0 |
| 0.8486111111111111 | 0 |
| 0.8493055555555555 | 0 |
| 0.85 | 0 |
| 0.8506944444444445 | 0 |
| 0.8513888888888889 | 0 |
| 0.8520833333333333 | 0 |
| 0.8527777777777777 | 0 |
| 0.8534722222222223 | 0 |
| 0.8541666666666666 | 0 |
| 0.8548611111111111 | 0 |
| 0.8555555555555556 | 0 |
| 0.8562500000000001 | 0 |
| 0.8569444444444444 | 0 |
| 0.8576388888888888 | 0 |
| 0.8583333333333334 | 0 |
| 0.8590277777777778 | 0 |
| 0.8597222222222222 | 0 |
| 0.8604166666666666 | 0 |
| 0.8611111111111112 | 0 |
| 0.8618055555555556 | 0 |
| 0.8624999999999999 | 0 |
| 0.8631944444444444 | 0 |
| 0.8638888888888889 | 0 |
| 0.8645833333333334 | 0 |
| 0.8652777777777777 | 0 |
| 0.8659722222222223 | 0 |
| 0.8666666666666667 | 0 |
| 0.8673611111111111 | 0 |
| 0.8680555555555555 | 0 |
| 0.86875 | 0 |
| 0.8694444444444445 | 0 |
| 0.8701388888888889 | 0 |
| 0.8708333333333332 | 0 |
| 0.8715277777777778 | 0 |
| 0.8722222222222222 | 0 |
| 0.8729166666666667 | 0 |
| 0.873611111111111 | 0 |
| 0.8743055555555556 | 0 |
| 0.875 | 0 |
| 0.8756944444444444 | 0 |
| 0.876388888888889 | 0 |
| 0.8770833333333333 | 0 |
| 0.8777777777777778 | 0 |
| 0.8784722222222222 | 0 |
| 0.8791666666666668 | 0 |
| 0.8798611111111111 | 0 |
| 0.8805555555555555 | 0 |
| 0.88125 | 0 |
| 0.8819444444444445 | 0 |
| 0.8826388888888889 | 0 |
| 0.8833333333333333 | 0 |
| 0.8840277777777777 | 0 |
| 0.8847222222222223 | 0 |
| 0.8854166666666666 | 0 |
| 0.8861111111111111 | 0 |
| 0.8868055555555556 | 0 |
| 0.8875000000000001 | 0 |
| 0.8881944444444444 | 0 |
| 0.8888888888888888 | 0 |
| 0.8895833333333334 | 0 |
| 0.8902777777777778 | 0 |
| 0.8909722222222222 | 0 |
| 0.8916666666666666 | 0 |
| 0.8923611111111112 | 0 |
| 0.8930555555555556 | 0 |
| 0.8937499999999999 | 0 |
| 0.8944444444444444 | 0 |
| 0.8951388888888889 | 0 |
| 0.8958333333333334 | 0 |
| 0.8965277777777777 | 0 |
| 0.8972222222222223 | 0 |
| 0.8979166666666667 | 0 |
| 0.8986111111111111 | 0 |
| 0.8993055555555555 | 0 |
| 0.9 | 0 |
| 0.9006944444444445 | 0 |
| 0.9013888888888889 | 0 |
| 0.9020833333333332 | 0 |
| 0.9027777777777778 | 0 |
| 0.9034722222222222 | 0 |
| 0.9041666666666667 | 0 |
| 0.904861111111111 | 0 |
| 0.9055555555555556 | 0 |
| 0.90625 | 0 |
| 0.9069444444444444 | 0 |
| 0.907638888888889 | 0 |
| 0.9083333333333333 | 0 |
| 0.9090277777777778 | 0 |
| 0.9097222222222222 | 0 |
| 0.9104166666666668 | 0 |
| 0.9111111111111111 | 0 |
| 0.9118055555555555 | 0 |
| 0.9125 | 0 |
| 0.9131944444444445 | 0 |
| 0.9138888888888889 | 0 |
| 0.9145833333333333 | 0 |
| 0.9152777777777777 | 0 |
| 0.9159722222222223 | 0 |
| 0.9166666666666666 | 0 |
| 0.9173611111111111 | 0 |
| 0.9180555555555556 | 0 |
| 0.9187500000000001 | 0 |
| 0.9194444444444444 | 0 |
| 0.9201388888888888 | 0 |
| 0.9208333333333334 | 0 |
| 0.9215277777777778 | 0 |
| 0.9222222222222222 | 0 |
| 0.9229166666666666 | 0 |
| 0.9236111111111112 | 0 |
| 0.9243055555555556 | 0 |
| 0.9249999999999999 | 0 |
| 0.9256944444444444 | 0 |
| 0.9263888888888889 | 0 |
| 0.9270833333333334 | 0 |
| 0.9277777777777777 | 0 |
| 0.9284722222222223 | 0 |
| 0.9291666666666667 | 0 |
| 0.9298611111111111 | 0 |
| 0.9305555555555555 | 0 |
| 0.93125 | 0 |
| 0.9319444444444445 | 0 |
| 0.9326388888888889 | 0 |
| 0.9333333333333332 | 0 |
| 0.9340277777777778 | 0 |
| 0.9347222222222222 | 0 |
| 0.9354166666666667 | 0 |
| 0.936111111111111 | 0 |
| 0.9368055555555556 | 0 |
| 0.9375 | 0 |
| 0.9381944444444444 | 0 |
| 0.938888888888889 | 0 |
| 0.9395833333333333 | 0 |
| 0.9402777777777778 | 0 |
| 0.9409722222222222 | 0 |
| 0.9416666666666668 | 0 |
| 0.9423611111111111 | 0 |
| 0.9430555555555555 | 0 |
| 0.94375 | 0 |
| 0.9444444444444445 | 0 |
| 0.9451388888888889 | 0 |
| 0.9458333333333333 | 0 |
| 0.9465277777777777 | 0 |
| 0.9472222222222223 | 0 |
| 0.9479166666666666 | 0 |
| 0.9486111111111111 | 0 |
| 0.9493055555555556 | 0 |
| 0.9500000000000001 | 0 |
| 0.9506944444444444 | 0 |
| 0.9513888888888888 | 0 |
| 0.9520833333333334 | 0 |
| 0.9527777777777778 | 0 |
| 0.9534722222222222 | 0 |
| 0.9541666666666666 | 0 |
| 0.9548611111111112 | 0 |
| 0.9555555555555556 | 0 |
| 0.9562499999999999 | 0 |
| 0.9569444444444444 | 0 |
| 0.9576388888888889 | 0 |
| 0.9583333333333334 | 0 |
| 0.9590277777777777 | 0 |
| 0.9597222222222223 | 0 |
| 0.9604166666666667 | 0 |
| 0.9611111111111111 | 0 |
| 0.9618055555555555 | 0 |
| 0.9625 | 0 |
| 0.9631944444444445 | 0 |
| 0.9638888888888889 | 0 |
| 0.9645833333333332 | 0 |
| 0.9652777777777778 | 0 |
| 0.9659722222222222 | 0 |
| 0.9666666666666667 | 0 |
| 0.967361111111111 | 0 |
| 0.9680555555555556 | 0 |
| 0.96875 | 0 |
| 0.9694444444444444 | 0 |
| 0.970138888888889 | 0 |
| 0.9708333333333333 | 0 |
| 0.9715277777777778 | 0 |
| 0.9722222222222222 | 0 |
| 0.9729166666666668 | 0 |
| 0.9736111111111111 | 0 |
| 0.9743055555555555 | 0 |
| 0.975 | 0 |
| 0.9756944444444445 | 0 |
| 0.9763888888888889 | 0 |
| 0.9770833333333333 | 0 |
| 0.9777777777777777 | 0 |
| 0.9784722222222223 | 0 |
| 0.9791666666666666 | 0 |
| 0.9798611111111111 | 0 |
| 0.9805555555555556 | 0 |
| 0.9812500000000001 | 0 |
| 0.9819444444444444 | 0 |
| 0.9826388888888888 | 0 |
| 0.9833333333333334 | 0 |
| 0.9840277777777778 | 0 |
| 0.9847222222222222 | 0 |
| 0.9854166666666666 | 0 |
| 0.9861111111111112 | 0 |
| 0.9868055555555556 | 0 |
| 0.9874999999999999 | 0 |
| 0.9881944444444444 | 0 |
| 0.9888888888888889 | 0 |
| 0.9895833333333334 | 0 |
| 0.9902777777777777 | 0 |
| 0.9909722222222223 | 0 |
| 0.9916666666666667 | 0 |
| 0.9923611111111111 | 0 |
| 0.9930555555555555 | 0 |
| 0.99375 | 0 |
| 0.9944444444444445 | 0 |
| 0.9951388888888889 | 0 |
| 0.9958333333333332 | 0 |
| 0.9965277777777778 | 0 |
| 0.9972222222222222 | 0 |
| 0.9979166666666667 | 0 |
| 0.998611111111111 | 0 |
| 0.9993055555555556 | 0 |